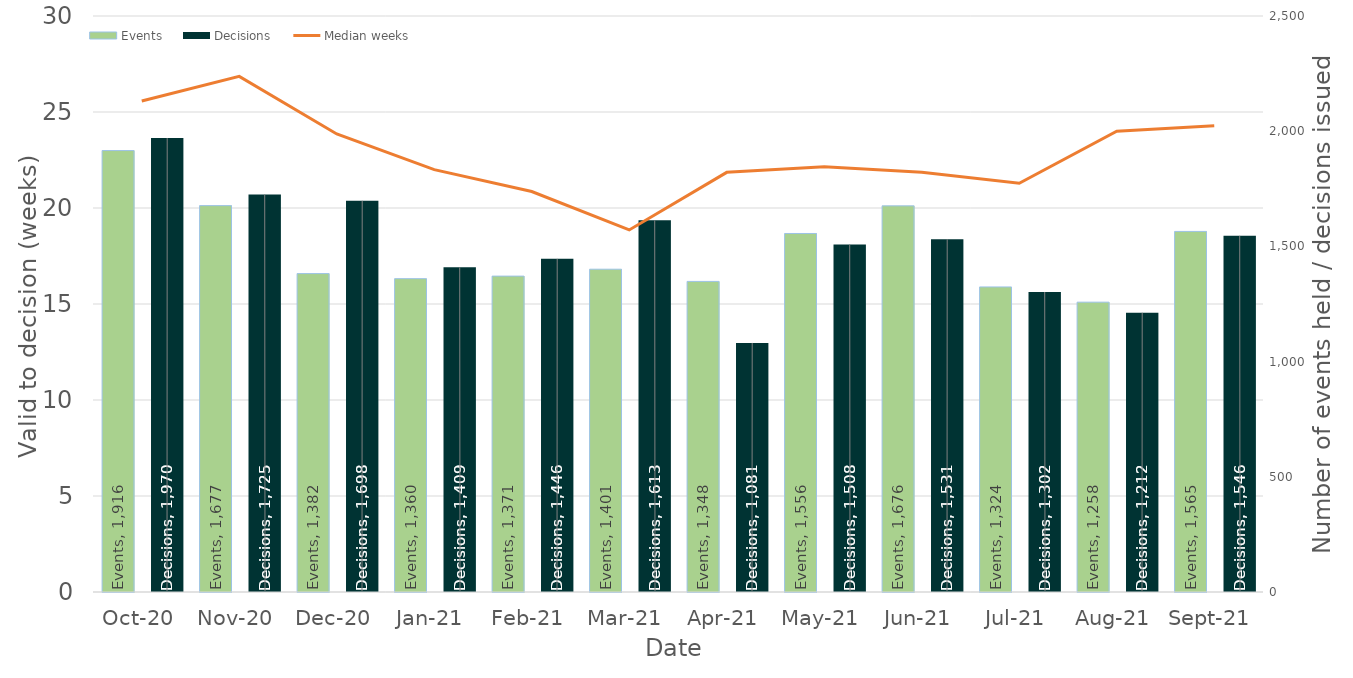
| Category | Events | Decisions |
|---|---|---|
| 0 | 1916 | 1970 |
| 1900-01-01 | 1677 | 1725 |
| 1900-01-02 | 1382 | 1698 |
| 1900-01-03 | 1360 | 1409 |
| 1900-01-04 | 1371 | 1446 |
| 1900-01-05 | 1401 | 1613 |
| 1900-01-06 | 1348 | 1081 |
| 1900-01-07 | 1556 | 1508 |
| 1900-01-08 | 1676 | 1531 |
| 1900-01-09 | 1324 | 1302 |
| 1900-01-10 | 1258 | 1212 |
| 1900-01-11 | 1565 | 1546 |